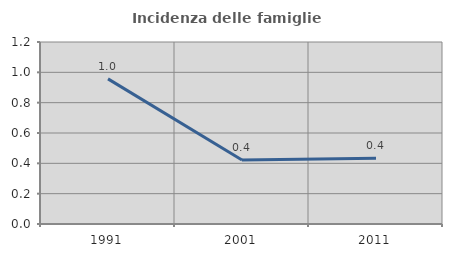
| Category | Incidenza delle famiglie numerose |
|---|---|
| 1991.0 | 0.957 |
| 2001.0 | 0.422 |
| 2011.0 | 0.433 |